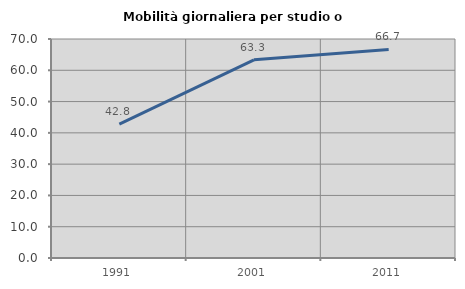
| Category | Mobilità giornaliera per studio o lavoro |
|---|---|
| 1991.0 | 42.775 |
| 2001.0 | 63.333 |
| 2011.0 | 66.667 |